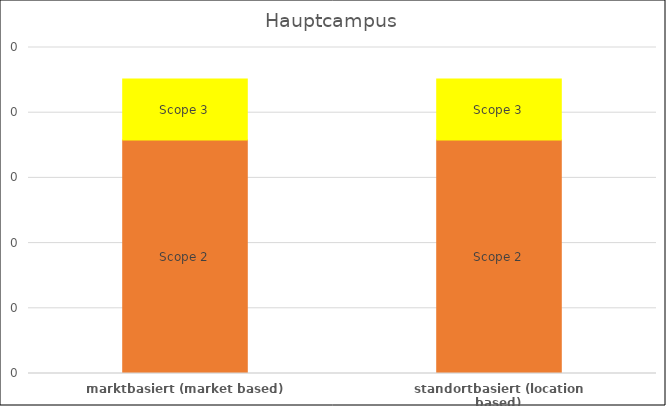
| Category | Scope 2 | Scope 3 |
|---|---|---|
| marktbasiert (market based) | 0.179 | 0.047 |
| standortbasiert (location based) | 0.179 | 0.047 |